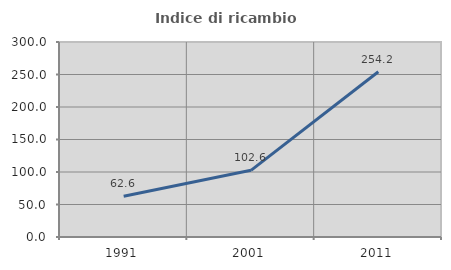
| Category | Indice di ricambio occupazionale  |
|---|---|
| 1991.0 | 62.565 |
| 2001.0 | 102.593 |
| 2011.0 | 254.211 |